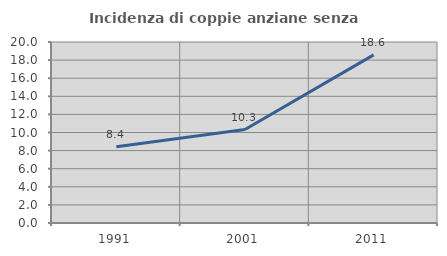
| Category | Incidenza di coppie anziane senza figli  |
|---|---|
| 1991.0 | 8.434 |
| 2001.0 | 10.326 |
| 2011.0 | 18.579 |